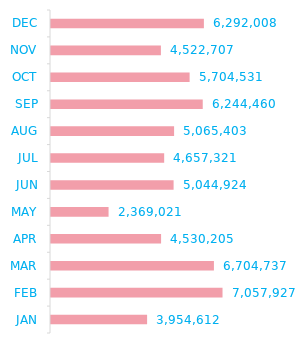
| Category | Total |
|---|---|
| JAN | 3954612 |
| FEB | 7057927 |
| MAR | 6704737 |
| APR | 4530205 |
| MAY | 2369021 |
| JUN | 5044924 |
| JUL | 4657321 |
| AUG | 5065403 |
| SEP | 6244460 |
| OCT | 5704531 |
| NOV | 4522707 |
| DEC | 6292008 |